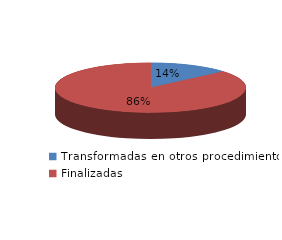
| Category | Series 0 |
|---|---|
| Transformadas en otros procedimientos | 894 |
| Finalizadas | 5683 |